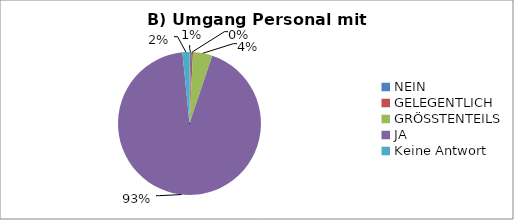
| Category | Series 0 |
|---|---|
| NEIN | 1 |
| GELEGENTLICH | 1 |
| GRÖSSTENTEILS | 11 |
| JA | 235 |
| Keine Antwort | 4 |